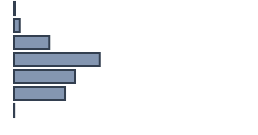
| Category | Percentatge |
|---|---|
| 0 | 0.427 |
| 1 | 2.39 |
| 2 | 14.695 |
| 3 | 35.734 |
| 4 | 25.42 |
| 5 | 21.263 |
| 6 | 0.071 |